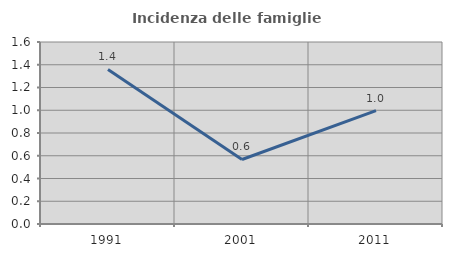
| Category | Incidenza delle famiglie numerose |
|---|---|
| 1991.0 | 1.359 |
| 2001.0 | 0.567 |
| 2011.0 | 0.996 |